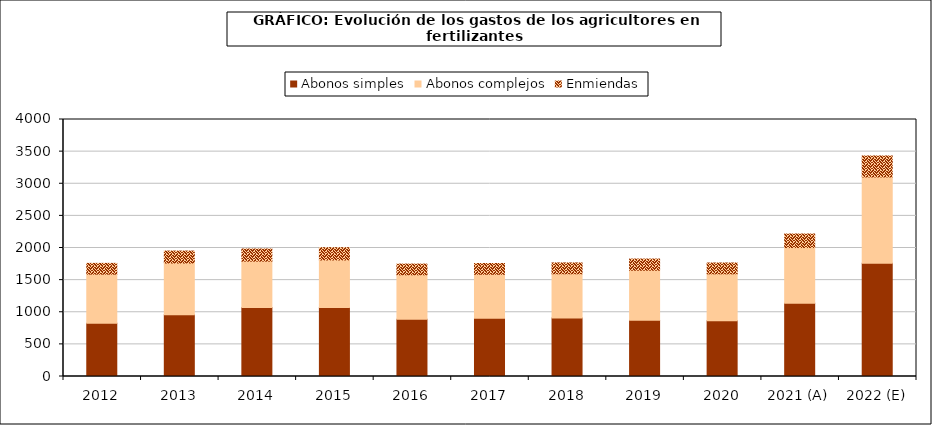
| Category | Abonos simples | Abonos complejos | Enmiendas |
|---|---|---|---|
| 2012 | 828.171 | 764.88 | 167.637 |
| 2013 | 959.679 | 806.665 | 185.766 |
| 2014 | 1074.953 | 720.53 | 188.831 |
| 2015 | 1074.955 | 739.068 | 190.781 |
| 2016 | 891.426 | 691.817 | 166.51 |
| 2017 | 906.183 | 686.53 | 167.506 |
| 2018 | 908.668 | 690.56 | 168.191 |
| 2019 | 876.483 | 777.519 | 173.951 |
| 2020 | 866.521 | 731.704 | 168.085 |
| 2021 (A) | 1139.319 | 867.558 | 211.063 |
| 2022 (E) | 1763.306 | 1342.705 | 326.659 |